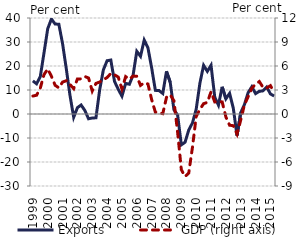
| Category | Exports |
|---|---|
| 1999.0 | 13.81 |
| nan | 12.588 |
| nan | 15.563 |
| nan | 25.432 |
| 2000.0 | 35.508 |
| nan | 39.598 |
| nan | 37.486 |
| nan | 37.402 |
| 2001.0 | 29.355 |
| nan | 18.908 |
| nan | 7.788 |
| nan | -1.359 |
| 2002.0 | 2.614 |
| nan | 3.768 |
| nan | 1.477 |
| nan | -1.985 |
| 2003.0 | -1.663 |
| nan | -1.588 |
| nan | 10.083 |
| nan | 18.431 |
| 2004.0 | 22.207 |
| nan | 22.487 |
| nan | 13.574 |
| nan | 10.303 |
| 2005.0 | 7.421 |
| nan | 12.754 |
| nan | 12.399 |
| nan | 16.177 |
| 2006.0 | 26.112 |
| nan | 24.041 |
| nan | 30.821 |
| nan | 27.577 |
| 2007.0 | 19.248 |
| nan | 9.848 |
| nan | 9.763 |
| nan | 8.556 |
| 2008.0 | 17.775 |
| nan | 13.249 |
| nan | 1.817 |
| nan | -0.454 |
| 2009.0 | -12.861 |
| nan | -11.775 |
| nan | -6.648 |
| nan | -3.706 |
| 2010.0 | 1.98 |
| nan | 12.832 |
| nan | 20.283 |
| nan | 17.767 |
| 2011.0 | 20.295 |
| nan | 7.022 |
| nan | 3.674 |
| nan | 11.326 |
| 2012.0 | 6.321 |
| nan | 8.594 |
| nan | 2.397 |
| nan | -9.013 |
| 2013.0 | 0.539 |
| nan | 3.955 |
| nan | 8.924 |
| nan | 11.373 |
| 2014.0 | 8.488 |
| nan | 9.45 |
| nan | 9.646 |
| nan | 11.207 |
| 2015.0 | 8.362 |
| nan | 7.487 |